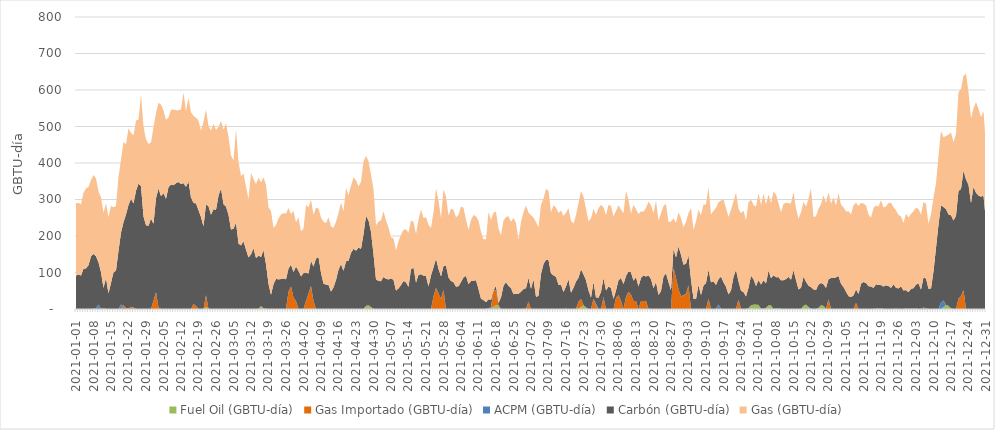
| Category | Fuel Oil (GBTU-día) | Gas Importado (GBTU-día) | ACPM (GBTU-día) | Carbón (GBTU-día) | Gas (GBTU-día) |
|---|---|---|---|---|---|
| 2021-01-01 | 0 | 0 | 0.155 | 91.395 | 199.027 |
| 2021-01-02 | 0 | 0 | 0.161 | 94.225 | 195.952 |
| 2021-01-03 | 0 | 0 | 0.156 | 91.66 | 195.022 |
| 2021-01-04 | 0 | 0 | 0.273 | 109.837 | 208.537 |
| 2021-01-05 | 0 | 0 | 0.304 | 111.113 | 218.6 |
| 2021-01-06 | 0 | 0 | 0.289 | 119.66 | 214.749 |
| 2021-01-07 | 0 | 0 | 0.258 | 144.221 | 208.81 |
| 2021-01-08 | 0 | 0 | 0.267 | 150.85 | 216.109 |
| 2021-01-09 | 0 | 0 | 3.212 | 141.379 | 213.148 |
| 2021-01-10 | 0 | 0 | 12.281 | 115.816 | 194.234 |
| 2021-01-11 | 0 | 0 | 0.274 | 100.798 | 204.991 |
| 2021-01-12 | 0 | 1.872 | 0.294 | 55.542 | 206.391 |
| 2021-01-13 | 0 | 0 | 0.273 | 84.012 | 205.484 |
| 2021-01-14 | 0 | 0 | 0.294 | 42.103 | 209.018 |
| 2021-01-15 | 0 | 0 | 0.281 | 71.565 | 210.8 |
| 2021-01-16 | 0 | 0 | 0.159 | 99.991 | 178.57 |
| 2021-01-17 | 0 | 0 | 0.17 | 105.103 | 177.132 |
| 2021-01-18 | 0 | 0 | 0.201 | 159.349 | 203.023 |
| 2021-01-19 | 0 | 0 | 12.152 | 196.972 | 199.745 |
| 2021-01-20 | 0 | 9.55 | 0.131 | 228.429 | 219.412 |
| 2021-01-21 | 0 | 2.667 | 0.153 | 256.128 | 191.978 |
| 2021-01-22 | 0 | 1 | 0.164 | 283.972 | 209.765 |
| 2021-01-23 | 0 | 6.026 | 0.141 | 295.876 | 180.923 |
| 2021-01-24 | 0 | 4.007 | 0.294 | 284.781 | 186.232 |
| 2021-01-25 | 0 | 0 | 0.167 | 323.901 | 192.458 |
| 2021-01-26 | 0 | 0 | 0.151 | 343.138 | 175.648 |
| 2021-01-27 | 0 | 0 | 0.108 | 336.235 | 251.598 |
| 2021-01-28 | 0 | 0 | 0.158 | 253.364 | 245.975 |
| 2021-01-29 | 0 | 0 | 0.261 | 229.106 | 235.355 |
| 2021-01-30 | 0 | 0 | 0.268 | 227.919 | 223.8 |
| 2021-01-31 | 0 | 0 | 0.208 | 247.563 | 208.448 |
| 2021-02-01 | 0 | 22 | 0.548 | 211.065 | 264.565 |
| 2021-02-02 | 0 | 45.943 | 0.116 | 257.383 | 233.464 |
| 2021-02-03 | 0 | 3.843 | 0.127 | 325.674 | 235.259 |
| 2021-02-04 | 0 | 0 | 0.162 | 309.049 | 250.796 |
| 2021-02-05 | 0 | 0 | 0.212 | 317.383 | 226.738 |
| 2021-02-06 | 0 | 0 | 0.207 | 301.43 | 216.889 |
| 2021-02-07 | 0 | 0 | 0.142 | 333.772 | 190.321 |
| 2021-02-08 | 0 | 0 | 0.21 | 340.872 | 204.776 |
| 2021-02-09 | 0 | 0 | 0.176 | 339.007 | 207.302 |
| 2021-02-10 | 0 | 0 | 0.2 | 344.716 | 199.419 |
| 2021-02-11 | 0 | 0 | 0.179 | 347.677 | 196.519 |
| 2021-02-12 | 0 | 0 | 0.173 | 342.435 | 204.071 |
| 2021-02-13 | 0 | 0 | 0.126 | 344.819 | 248.465 |
| 2021-02-14 | 0 | 0 | 0.158 | 334.405 | 207.777 |
| 2021-02-15 | 0 | 0 | 0.162 | 348.954 | 229.462 |
| 2021-02-16 | 0 | 0 | 0.038 | 305.555 | 233.585 |
| 2021-02-17 | 0 | 13.644 | 0 | 276.983 | 238.559 |
| 2021-02-18 | 0 | 8.385 | 0 | 280.982 | 234.614 |
| 2021-02-19 | 0 | 0 | 0 | 270.512 | 245.711 |
| 2021-02-20 | 0 | 0 | 0 | 251.759 | 236.785 |
| 2021-02-21 | 0 | 0 | 0 | 226.348 | 286.547 |
| 2021-02-22 | 6.568 | 31.6 | 0.198 | 248.284 | 259.465 |
| 2021-02-23 | 0.346 | 0 | 0.178 | 280.951 | 220.172 |
| 2021-02-24 | 0 | 0 | 0.171 | 258.36 | 230.235 |
| 2021-02-25 | 0 | 0 | 0.249 | 273.015 | 233.969 |
| 2021-02-26 | 0 | 0 | 0.156 | 271.526 | 218.997 |
| 2021-02-27 | 0 | 0 | 0.122 | 310.712 | 187.92 |
| 2021-02-28 | 0 | 0 | 0.119 | 329.993 | 185.231 |
| 2021-03-01 | 0 | 0 | 0.236 | 287.305 | 204.228 |
| 2021-03-02 | 0 | 0 | 0.27 | 280.339 | 227.806 |
| 2021-03-03 | 0 | 0 | 0.244 | 258.138 | 213.296 |
| 2021-03-04 | 0 | 0 | 0.238 | 217.565 | 202.814 |
| 2021-03-05 | 0 | 0 | 0.14 | 219.567 | 187.24 |
| 2021-03-06 | 0 | 0 | 0.144 | 236.876 | 255.879 |
| 2021-03-07 | 0 | 0 | 0.157 | 179.129 | 224.229 |
| 2021-03-08 | 0 | 0 | 0.004 | 174.295 | 190.071 |
| 2021-03-09 | 0 | 0 | 0 | 185.583 | 185.522 |
| 2021-03-10 | 0 | 0 | 0 | 162.749 | 172.568 |
| 2021-03-11 | 0 | 0 | 0 | 141.41 | 159.735 |
| 2021-03-12 | 0 | 0 | 0.013 | 149.668 | 223.246 |
| 2021-03-13 | 0 | 0 | 0 | 166.722 | 189.952 |
| 2021-03-14 | 0 | 0 | 0 | 139.462 | 202.66 |
| 2021-03-15 | 0 | 0 | 0 | 146.558 | 212.623 |
| 2021-03-16 | 8.155 | 0 | 0.113 | 134.242 | 204.694 |
| 2021-03-17 | 0.655 | 0 | 1.011 | 159.604 | 199.476 |
| 2021-03-18 | 0 | 0 | 0.443 | 122.188 | 217.736 |
| 2021-03-19 | 0 | 0 | 0.078 | 69.069 | 209.248 |
| 2021-03-20 | 0 | 0 | 0 | 38.628 | 229.429 |
| 2021-03-21 | 0 | 0 | 0 | 68.197 | 154.156 |
| 2021-03-22 | 0 | 0 | 0 | 82.539 | 147.559 |
| 2021-03-23 | 0 | 0 | 0 | 81.101 | 166.694 |
| 2021-03-24 | 0 | 0 | 0 | 82.003 | 176.96 |
| 2021-03-25 | 0 | 0 | 0 | 83.825 | 178.68 |
| 2021-03-26 | 0 | 0 | 0 | 81.276 | 179.926 |
| 2021-03-27 | 0 | 47.99 | 0 | 62.852 | 165.603 |
| 2021-03-28 | 0 | 61.872 | 0 | 59.829 | 138.38 |
| 2021-03-29 | 0 | 31.302 | 0 | 69.824 | 167.941 |
| 2021-03-30 | 0 | 22 | 0 | 94.484 | 120.987 |
| 2021-03-31 | 0 | 0 | 0 | 104.507 | 146.643 |
| 2021-04-01 | 0 | 0 | 0 | 89.493 | 123.193 |
| 2021-04-02 | 0 | 0 | 0 | 98.361 | 122.139 |
| 2021-04-03 | 0 | 22 | 0.094 | 77.102 | 185.772 |
| 2021-04-04 | 0 | 43 | 0.163 | 54.13 | 181.051 |
| 2021-04-05 | 0 | 61.72 | 1.612 | 68.976 | 167.171 |
| 2021-04-06 | 0 | 21.646 | 0.175 | 94.16 | 141.95 |
| 2021-04-07 | 0 | 0 | 0.039 | 138.217 | 139.599 |
| 2021-04-08 | 0 | 0 | 0 | 142.759 | 132.343 |
| 2021-04-09 | 0 | 0 | 0.132 | 99.243 | 151.178 |
| 2021-04-10 | 0 | 0 | 0.125 | 69.243 | 169.901 |
| 2021-04-11 | 0 | 0 | 0.146 | 66.689 | 168.236 |
| 2021-04-12 | 0 | 0 | 0.2 | 65.795 | 185.188 |
| 2021-04-13 | 0 | 0 | 0.043 | 47.749 | 178.483 |
| 2021-04-14 | 0 | 0 | 0 | 59.483 | 162.965 |
| 2021-04-15 | 0 | 0 | 0.238 | 79.412 | 159.09 |
| 2021-04-16 | 0 | 0 | 0.203 | 107.173 | 155.381 |
| 2021-04-17 | 0 | 0 | 0.2 | 123.009 | 168.087 |
| 2021-04-18 | 0 | 0 | 0.182 | 104.344 | 163.026 |
| 2021-04-19 | 0 | 0 | 0.196 | 130.387 | 201.541 |
| 2021-04-20 | 0 | 0 | 0.25 | 132.304 | 178.394 |
| 2021-04-21 | 0 | 0 | 0 | 153.894 | 183.98 |
| 2021-04-22 | 0 | 0 | 0.202 | 164.599 | 195.733 |
| 2021-04-23 | 0 | 0 | 0 | 160.033 | 193.014 |
| 2021-04-24 | 0 | 0 | 0.32 | 167.647 | 167.347 |
| 2021-04-25 | 0 | 0 | 0 | 165.031 | 183.809 |
| 2021-04-26 | 0 | 0 | 0.177 | 204.517 | 199.278 |
| 2021-04-27 | 8.517 | 0 | 0 | 246.365 | 164.693 |
| 2021-04-28 | 10.004 | 0 | 0.198 | 232.674 | 162.371 |
| 2021-04-29 | 5.276 | 0 | 0 | 206.134 | 156.451 |
| 2021-04-30 | 0 | 0 | 0.234 | 149.885 | 178.488 |
| 2021-05-01 | 0 | 0 | 0 | 81.118 | 148.42 |
| 2021-05-02 | 0 | 0 | 0.215 | 76.723 | 162.467 |
| 2021-05-03 | 0 | 0 | 0.046 | 76.015 | 166.749 |
| 2021-05-04 | 0 | 0 | 0 | 87.9 | 180.091 |
| 2021-05-05 | 0 | 0 | 0 | 82.7 | 159.634 |
| 2021-05-06 | 0 | 0 | 0 | 81.004 | 142.311 |
| 2021-05-07 | 0 | 0 | 0 | 83.918 | 111.947 |
| 2021-05-08 | 0 | 0 | 0 | 80.078 | 113.631 |
| 2021-05-09 | 0 | 0 | 0 | 50.419 | 110.287 |
| 2021-05-10 | 0 | 0 | 0 | 56.649 | 128.919 |
| 2021-05-11 | 0 | 0 | 0 | 65.683 | 138.022 |
| 2021-05-12 | 0 | 0 | 0 | 76.793 | 140.178 |
| 2021-05-13 | 0 | 0 | 0 | 72.98 | 145.082 |
| 2021-05-14 | 0 | 0 | 0 | 60.463 | 148.8 |
| 2021-05-15 | 0 | 0 | 0 | 108.989 | 133.252 |
| 2021-05-16 | 0 | 0 | 0 | 113.494 | 125.582 |
| 2021-05-17 | 0 | 0 | 0.15 | 72.409 | 132.456 |
| 2021-05-18 | 0 | 0 | 0.14 | 93.061 | 152.05 |
| 2021-05-19 | 0 | 0 | 0.175 | 95.271 | 176.947 |
| 2021-05-20 | 0 | 0 | 0.158 | 91.151 | 158.369 |
| 2021-05-21 | 0 | 0 | 0.105 | 90.666 | 160.139 |
| 2021-05-22 | 0 | 0 | 0.264 | 61.042 | 169.316 |
| 2021-05-23 | 0 | 0 | 0.043 | 92.247 | 129.693 |
| 2021-05-24 | 0 | 34.884 | 0.085 | 79.178 | 151.114 |
| 2021-05-25 | 0 | 57.679 | 0.137 | 80.012 | 192.846 |
| 2021-05-26 | 0 | 41.995 | 0.235 | 67.864 | 187.473 |
| 2021-05-27 | 0 | 27.864 | 0.275 | 60.947 | 160.614 |
| 2021-05-28 | 0 | 52.248 | 0.268 | 65.614 | 209.595 |
| 2021-05-29 | 0 | 0 | 0.212 | 118.865 | 189.031 |
| 2021-05-30 | 0 | 0 | 0.219 | 86.139 | 169.54 |
| 2021-05-31 | 0 | 0 | 0.183 | 76.447 | 198.177 |
| 2021-06-01 | 0 | 0 | 0.183 | 73.324 | 197.98 |
| 2021-06-02 | 0 | 0 | 0.257 | 60.949 | 189.866 |
| 2021-06-03 | 0 | 0 | 0.288 | 62.267 | 195.446 |
| 2021-06-04 | 0 | 0 | 0.231 | 73.613 | 206.999 |
| 2021-06-05 | 0 | 0 | 0.133 | 86.536 | 190.464 |
| 2021-06-06 | 0 | 0 | 0.064 | 90.685 | 154.133 |
| 2021-06-07 | 0 | 0 | 0 | 68.093 | 148.65 |
| 2021-06-08 | 0 | 0 | 0 | 76.568 | 167.607 |
| 2021-06-09 | 0 | 0 | 0 | 77.464 | 179.982 |
| 2021-06-10 | 0 | 0 | 0 | 78.838 | 174.791 |
| 2021-06-11 | 0 | 0 | 0.094 | 54.563 | 187.681 |
| 2021-06-12 | 0 | 0 | 0.167 | 27.943 | 183.147 |
| 2021-06-13 | 0 | 0 | 0.142 | 24.444 | 166.57 |
| 2021-06-14 | 0 | 0 | 0.263 | 18.488 | 172.105 |
| 2021-06-15 | 0 | 2 | 0.24 | 24.351 | 239.632 |
| 2021-06-16 | 0 | 0 | 5.381 | 19.724 | 218.143 |
| 2021-06-17 | 6.155 | 44.919 | 0.238 | 0 | 212.931 |
| 2021-06-18 | 10.156 | 40.77 | 0.437 | 12.22 | 202.654 |
| 2021-06-19 | 9.224 | 0 | 0.396 | 6.832 | 204.055 |
| 2021-06-20 | 0 | 0 | 0.096 | 31.974 | 170.052 |
| 2021-06-21 | 0 | 0 | 0.188 | 63.512 | 178.489 |
| 2021-06-22 | 0 | 0 | 0 | 73.651 | 178.45 |
| 2021-06-23 | 0 | 0 | 0 | 63.252 | 190.711 |
| 2021-06-24 | 0 | 0 | 0 | 57.546 | 181.066 |
| 2021-06-25 | 0 | 0 | 0 | 40.649 | 208.837 |
| 2021-06-26 | 0 | 0 | 0 | 41.46 | 194.542 |
| 2021-06-27 | 0 | 0 | 0 | 41.597 | 148.656 |
| 2021-06-28 | 0 | 0 | 0 | 47.661 | 190.957 |
| 2021-06-29 | 0 | 0 | 0.751 | 53.934 | 211.072 |
| 2021-06-30 | 0 | 0 | 0.595 | 56.589 | 226.364 |
| 2021-07-01 | 0 | 19.5 | 0.554 | 65.494 | 178.873 |
| 2021-07-02 | 0 | 0 | 0 | 55.327 | 201.744 |
| 2021-07-03 | 0 | 0 | 0 | 81.522 | 168.926 |
| 2021-07-04 | 0 | 0 | 0 | 33.087 | 205.287 |
| 2021-07-05 | 0 | 0 | 0 | 36.221 | 187.171 |
| 2021-07-06 | 0 | 0 | 0 | 95.939 | 189.141 |
| 2021-07-07 | 0 | 0 | 0 | 123.179 | 179.073 |
| 2021-07-08 | 0 | 0 | 0 | 135.044 | 193.7 |
| 2021-07-09 | 0 | 0 | 0 | 134.274 | 189.782 |
| 2021-07-10 | 0 | 0 | 0 | 97.453 | 167.329 |
| 2021-07-11 | 0 | 0 | 0 | 92.023 | 192.768 |
| 2021-07-12 | 0 | 0 | 0 | 88.222 | 189.412 |
| 2021-07-13 | 0 | 0 | 0 | 66.341 | 196.953 |
| 2021-07-14 | 0 | 0 | 0 | 66.489 | 203.526 |
| 2021-07-15 | 0 | 0 | 0.275 | 46.07 | 208.557 |
| 2021-07-16 | 0 | 0 | 0.425 | 61.727 | 201.582 |
| 2021-07-17 | 0 | 0 | 0.175 | 81.354 | 194.372 |
| 2021-07-18 | 0 | 0 | 0.199 | 44.524 | 196.964 |
| 2021-07-19 | 0 | 0 | 0.286 | 57.68 | 175.862 |
| 2021-07-20 | 0 | 0 | 0.117 | 75.096 | 182.278 |
| 2021-07-21 | 0 | 20.112 | 0.194 | 65.272 | 204.846 |
| 2021-07-22 | 5.705 | 21.383 | 0.226 | 81.842 | 213.843 |
| 2021-07-23 | 10.513 | 0 | 0.248 | 83.811 | 213.439 |
| 2021-07-24 | 4.221 | 0 | 0.187 | 74.687 | 195.725 |
| 2021-07-25 | 0 | 0 | 0.085 | 51.085 | 188.645 |
| 2021-07-26 | 0 | 0 | 0.165 | 31.08 | 217.096 |
| 2021-07-27 | 0 | 28.2 | 0.21 | 45.874 | 201.113 |
| 2021-07-28 | 0 | 9.2 | 4.205 | 18.263 | 226.066 |
| 2021-07-29 | 0 | 0 | 0.299 | 30.755 | 245.539 |
| 2021-07-30 | 0 | 0 | 0.172 | 46.815 | 238.561 |
| 2021-07-31 | 0 | 32.602 | 0.244 | 52.416 | 192.77 |
| 2021-08-01 | 0 | 0 | 0.145 | 50.564 | 206.362 |
| 2021-08-02 | 0 | 0 | 0.235 | 61.338 | 223.524 |
| 2021-08-03 | 0 | 0 | 0.213 | 57.286 | 225.209 |
| 2021-08-04 | 0 | 0 | 0.185 | 27.665 | 225.486 |
| 2021-08-05 | 0 | 30.136 | 0.248 | 20.298 | 218.048 |
| 2021-08-06 | 0 | 38.515 | 0.201 | 40.267 | 205.416 |
| 2021-08-07 | 0 | 22 | 0.229 | 62.681 | 187.369 |
| 2021-08-08 | 0 | 0 | 0.17 | 67.941 | 194.456 |
| 2021-08-09 | 0 | 32.349 | 1.116 | 56.738 | 234 |
| 2021-08-10 | 0 | 46.614 | 0.661 | 56.078 | 194.991 |
| 2021-08-11 | 0 | 39.26 | 0.231 | 60.914 | 161.373 |
| 2021-08-12 | 0 | 22 | 0.236 | 55.642 | 207.765 |
| 2021-08-13 | 0 | 22 | 0.189 | 65.079 | 186.2 |
| 2021-08-14 | 0 | 0 | 0.239 | 61.44 | 198.637 |
| 2021-08-15 | 0 | 22 | 0.151 | 62.857 | 182.321 |
| 2021-08-16 | 0 | 22 | 0.166 | 69.718 | 174.809 |
| 2021-08-17 | 0 | 22 | 0.299 | 66.754 | 188.185 |
| 2021-08-18 | 0 | 0 | 0.39 | 91.28 | 202.447 |
| 2021-08-19 | 0 | 0 | 0.287 | 81.803 | 202.21 |
| 2021-08-20 | 0 | 0 | 0.31 | 56.344 | 205.696 |
| 2021-08-21 | 0 | 0 | 0.286 | 73.913 | 222.964 |
| 2021-08-22 | 0 | 0 | 0.287 | 38.124 | 203.968 |
| 2021-08-23 | 0 | 0 | 0.255 | 48.968 | 213.402 |
| 2021-08-24 | 0 | 0 | 0.303 | 88.922 | 192.981 |
| 2021-08-25 | 0 | 0 | 0.239 | 97.64 | 190.378 |
| 2021-08-26 | 0 | 0 | 0.259 | 73.261 | 164.215 |
| 2021-08-27 | 0 | 0 | 0.207 | 51.409 | 188.215 |
| 2021-08-28 | 0 | 112.884 | 0.2 | 52.452 | 82.771 |
| 2021-08-29 | 0 | 84.337 | 0.188 | 56.703 | 94.515 |
| 2021-08-30 | 0 | 54.425 | 0.196 | 116.612 | 94.199 |
| 2021-08-31 | 0 | 34.242 | 0.168 | 114.217 | 100.052 |
| 2021-09-01 | 0 | 37.743 | 0.149 | 83.441 | 102.185 |
| 2021-09-02 | 0 | 40.6 | 1.391 | 81.93 | 115.512 |
| 2021-09-03 | 0 | 64.7 | 0.267 | 81.964 | 115.73 |
| 2021-09-04 | 0 | 0 | 0.224 | 80.089 | 196.455 |
| 2021-09-05 | 0 | 0 | 0.24 | 27.557 | 188.594 |
| 2021-09-06 | 0 | 0 | 0.253 | 26.76 | 213.043 |
| 2021-09-07 | 0 | 0 | 0.231 | 65.48 | 206.395 |
| 2021-09-08 | 0 | 0 | 0.241 | 37.949 | 218.48 |
| 2021-09-09 | 0 | 0 | 0.25 | 64.231 | 222.207 |
| 2021-09-10 | 0 | 0 | 0.205 | 70.9 | 215.296 |
| 2021-09-11 | 0 | 27.727 | 0.247 | 79.77 | 226.883 |
| 2021-09-12 | 0 | 0 | 0.261 | 72.965 | 185.787 |
| 2021-09-13 | 0 | 0 | 0.175 | 75.659 | 193.064 |
| 2021-09-14 | 0 | 0 | 0.194 | 65.769 | 210.969 |
| 2021-09-15 | 0 | 0 | 12.392 | 69.375 | 210.847 |
| 2021-09-16 | 0 | 0 | 0.232 | 88.406 | 208.75 |
| 2021-09-17 | 0 | 0 | 0.159 | 73.215 | 226.779 |
| 2021-09-18 | 0 | 0 | 0.281 | 60.711 | 215.531 |
| 2021-09-19 | 0 | 0 | 0.208 | 39.583 | 212.283 |
| 2021-09-20 | 0 | 0 | 0.167 | 50.743 | 220.779 |
| 2021-09-21 | 0 | 0 | 0.168 | 87.846 | 207.062 |
| 2021-09-22 | 0 | 0 | 0.192 | 106.801 | 211.545 |
| 2021-09-23 | 0 | 25.883 | 0.202 | 49.928 | 198.854 |
| 2021-09-24 | 0 | 0 | 0.195 | 49.96 | 212.237 |
| 2021-09-25 | 0 | 0 | 0.157 | 46.347 | 223.013 |
| 2021-09-26 | 0 | 0 | 0.167 | 34.446 | 207.623 |
| 2021-09-27 | 2.254 | 0 | 0.201 | 55.527 | 234.798 |
| 2021-09-28 | 10.082 | 0 | 0.186 | 81.129 | 208.539 |
| 2021-09-29 | 11.726 | 0 | 0.206 | 69.97 | 202.981 |
| 2021-09-30 | 11.872 | 0 | 0.25 | 50.749 | 217.576 |
| 2021-10-01 | 11.004 | 0 | 0.218 | 68.086 | 237.49 |
| 2021-10-02 | 0.686 | 0 | 0.156 | 66.373 | 217.851 |
| 2021-10-03 | 0 | 0 | 0.247 | 78.284 | 236.571 |
| 2021-10-04 | 3.242 | 0 | 0.196 | 67.016 | 216.604 |
| 2021-10-05 | 10.025 | 0 | 0.221 | 94.569 | 208.726 |
| 2021-10-06 | 9.865 | 0 | 0.149 | 74.31 | 205.673 |
| 2021-10-07 | 0 | 0 | 0.186 | 92.249 | 229.08 |
| 2021-10-08 | 0 | 0 | 1.28 | 85.855 | 225.991 |
| 2021-10-09 | 0 | 0 | 2.203 | 85.138 | 203.215 |
| 2021-10-10 | 0 | 0 | 0.15 | 78.291 | 186.139 |
| 2021-10-11 | 0 | 0 | 0.231 | 78.547 | 208.763 |
| 2021-10-12 | 0 | 0 | 0.239 | 81.837 | 209.361 |
| 2021-10-13 | 0 | 0 | 0.268 | 87.564 | 201.651 |
| 2021-10-14 | 0 | 0 | 0.27 | 80.039 | 209.765 |
| 2021-10-15 | 0 | 0 | 0.238 | 106.584 | 214.032 |
| 2021-10-16 | 0 | 0 | 0.156 | 79.473 | 196.124 |
| 2021-10-17 | 0 | 0 | 0.147 | 53.594 | 193.767 |
| 2021-10-18 | 0.06 | 0 | 0.157 | 57.923 | 206.871 |
| 2021-10-19 | 8.682 | 0 | 0.192 | 79.881 | 204.786 |
| 2021-10-20 | 12.07 | 0 | 0.135 | 62.182 | 206.246 |
| 2021-10-21 | 4.416 | 0 | 1.179 | 58.233 | 238.626 |
| 2021-10-22 | 0 | 0 | 0.486 | 59.409 | 270.881 |
| 2021-10-23 | 0 | 0 | 0.206 | 53.575 | 197.802 |
| 2021-10-24 | 0 | 0 | 0.165 | 51.842 | 202.32 |
| 2021-10-25 | 3.029 | 0 | 0.215 | 63.552 | 208.469 |
| 2021-10-26 | 10.076 | 0 | 0.225 | 60.898 | 215.576 |
| 2021-10-27 | 8.605 | 0 | 0.238 | 58.79 | 243.652 |
| 2021-10-28 | 0 | 0 | 0.245 | 57.52 | 232.981 |
| 2021-10-29 | 0 | 25 | 1.702 | 54.971 | 238.258 |
| 2021-10-30 | 0 | 0 | 0.235 | 84.785 | 203.152 |
| 2021-10-31 | 0 | 0 | 0.235 | 84.663 | 221.033 |
| 2021-11-01 | 0 | 0 | 0.172 | 86.548 | 196.19 |
| 2021-11-02 | 0 | 0 | 0.26 | 90.144 | 227.518 |
| 2021-11-03 | 0 | 0 | 0.287 | 68.978 | 216.499 |
| 2021-11-04 | 0 | 0 | 0.272 | 60.08 | 218.302 |
| 2021-11-05 | 0 | 0 | 0.308 | 47.226 | 219.36 |
| 2021-11-06 | 0 | 0 | 0.28 | 35.091 | 232.552 |
| 2021-11-07 | 0 | 0 | 0.261 | 32.548 | 226.354 |
| 2021-11-08 | 0 | 0 | 0.26 | 36.926 | 246.588 |
| 2021-11-09 | 0 | 16.637 | 0.231 | 36.902 | 237.455 |
| 2021-11-10 | 0 | 0 | 0.298 | 40.623 | 241.602 |
| 2021-11-11 | 0 | 0 | 0.225 | 69.073 | 221.385 |
| 2021-11-12 | 0 | 0 | 0.197 | 73.759 | 215.111 |
| 2021-11-13 | 0 | 0 | 0.149 | 71.523 | 212.278 |
| 2021-11-14 | 0 | 0 | 0.29 | 62.044 | 196.162 |
| 2021-11-15 | 0 | 0 | 0.18 | 61.565 | 188.372 |
| 2021-11-16 | 0 | 0 | 0.303 | 57.59 | 218.881 |
| 2021-11-17 | 0 | 0 | 1.094 | 66.649 | 215.797 |
| 2021-11-18 | 0 | 0 | 1.44 | 64.733 | 214.424 |
| 2021-11-19 | 0 | 0 | 2.475 | 62.887 | 233.113 |
| 2021-11-20 | 0 | 0 | 0.207 | 61.503 | 216.353 |
| 2021-11-21 | 0 | 0 | 0.213 | 64.624 | 216.31 |
| 2021-11-22 | 0 | 0 | 0.264 | 62.628 | 227.538 |
| 2021-11-23 | 0 | 0 | 0.22 | 57.59 | 233.147 |
| 2021-11-24 | 0 | 0 | 0.192 | 67.481 | 211.625 |
| 2021-11-25 | 0 | 0 | 0.636 | 57.381 | 211.721 |
| 2021-11-26 | 0 | 0 | 0.132 | 56.232 | 201.229 |
| 2021-11-27 | 0 | 0 | 0.152 | 62.113 | 191.433 |
| 2021-11-28 | 0 | 0 | 0.168 | 50.665 | 184.937 |
| 2021-11-29 | 0 | 1 | 0.484 | 50.301 | 209.092 |
| 2021-11-30 | 0 | 0 | 0.408 | 45.625 | 204.481 |
| 2021-12-01 | 0 | 0 | 0.393 | 54.941 | 205.109 |
| 2021-12-02 | 0 | 0 | 0.967 | 55.965 | 211.2 |
| 2021-12-03 | 0 | 0 | 1.312 | 65.536 | 211.225 |
| 2021-12-04 | 0 | 0 | 0.177 | 70.121 | 203.347 |
| 2021-12-05 | 0 | 0 | 0.141 | 53.046 | 205.796 |
| 2021-12-06 | 0 | 0 | 4.488 | 81.865 | 206.79 |
| 2021-12-07 | 0 | 0 | 1.537 | 81.985 | 204.464 |
| 2021-12-08 | 0 | 0 | 0.146 | 55.444 | 177.117 |
| 2021-12-09 | 0 | 0 | 0.196 | 55.957 | 203.434 |
| 2021-12-10 | 0 | 0 | 0.189 | 103.133 | 201.796 |
| 2021-12-11 | 0 | 0 | 0.159 | 167.32 | 177.78 |
| 2021-12-12 | 0 | 0 | 0.151 | 231.056 | 188.134 |
| 2021-12-13 | 0 | 0 | 18.053 | 266.049 | 204.058 |
| 2021-12-14 | 5.267 | 0 | 18.06 | 255.995 | 191.376 |
| 2021-12-15 | 11.172 | 0 | 0.13 | 262.385 | 200.38 |
| 2021-12-16 | 8.536 | 0 | 0.233 | 250.425 | 218.548 |
| 2021-12-17 | 1.522 | 0 | 0.179 | 254.97 | 226.987 |
| 2021-12-18 | 0 | 0 | 0.132 | 242.476 | 214.25 |
| 2021-12-19 | 0 | 0 | 0.151 | 255.089 | 224.631 |
| 2021-12-20 | 0 | 27.852 | 0.22 | 295.556 | 270.499 |
| 2021-12-21 | 0 | 35.378 | 0.148 | 293.341 | 273.967 |
| 2021-12-22 | 0 | 52.009 | 0.187 | 327.055 | 259.357 |
| 2021-12-23 | 0 | 0 | 0.18 | 355.107 | 289.13 |
| 2021-12-24 | 0 | 0 | 0.2 | 340.12 | 254.413 |
| 2021-12-25 | 0 | 0 | 0.096 | 289.987 | 231.701 |
| 2021-12-26 | 0 | 0 | 0.149 | 334.34 | 215.56 |
| 2021-12-27 | 0 | 0 | 0.186 | 318.282 | 248.417 |
| 2021-12-28 | 0 | 0 | 0.198 | 310.5 | 237.825 |
| 2021-12-29 | 0 | 0 | 0.214 | 307.575 | 217.702 |
| 2021-12-30 | 0 | 0 | 0.208 | 310.604 | 231.632 |
| 2021-12-31 | 0 | 0 | 0.137 | 239.477 | 203.06 |